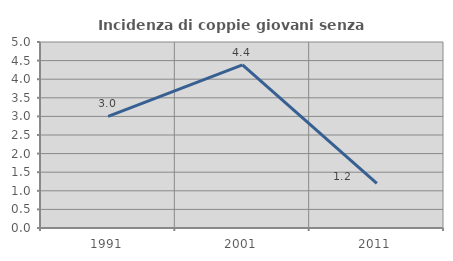
| Category | Incidenza di coppie giovani senza figli |
|---|---|
| 1991.0 | 3 |
| 2001.0 | 4.384 |
| 2011.0 | 1.199 |